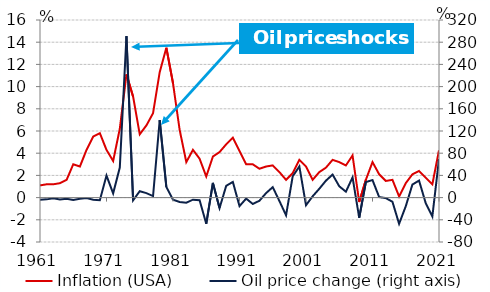
| Category | Inflation (USA) |
|---|---|
| 22282.0 | 1.1 |
| 22647.0 | 1.2 |
| 23012.0 | 1.2 |
| 23377.0 | 1.3 |
| 23743.0 | 1.6 |
| 24108.0 | 3 |
| 24473.0 | 2.8 |
| 24838.0 | 4.3 |
| 25204.0 | 5.5 |
| 25569.0 | 5.8 |
| 25934.0 | 4.3 |
| 26299.0 | 3.3 |
| 26665.0 | 6.2 |
| 27030.0 | 11.1 |
| 27395.0 | 9.1 |
| 27760.0 | 5.7 |
| 28126.0 | 6.5 |
| 28491.0 | 7.6 |
| 28856.0 | 11.3 |
| 29221.0 | 13.5 |
| 29587.0 | 10.3 |
| 29952.0 | 6.1 |
| 30317.0 | 3.2 |
| 30682.0 | 4.3 |
| 31048.0 | 3.5 |
| 31413.0 | 1.9 |
| 31778.0 | 3.7 |
| 32143.0 | 4.1 |
| 32509.0 | 4.8 |
| 32874.0 | 5.4 |
| 33239.0 | 4.2 |
| 33604.0 | 3 |
| 33970.0 | 3 |
| 34335.0 | 2.6 |
| 34700.0 | 2.8 |
| 35065.0 | 2.9 |
| 35431.0 | 2.3 |
| 35796.0 | 1.6 |
| 36161.0 | 2.2 |
| 36526.0 | 3.4 |
| 36892.0 | 2.8 |
| 37257.0 | 1.6 |
| 37622.0 | 2.3 |
| 37987.0 | 2.7 |
| 38353.0 | 3.4 |
| 38718.0 | 3.2 |
| 39083.0 | 2.9 |
| 39448.0 | 3.8 |
| 39814.0 | -0.4 |
| 40179.0 | 1.6 |
| 40544.0 | 3.2 |
| 40909.0 | 2.1 |
| 41275.0 | 1.5 |
| 41640.0 | 1.6 |
| 42005.0 | 0.1 |
| 42370.0 | 1.3 |
| 42736.0 | 2.1 |
| 43101.0 | 2.4 |
| 43466.0 | 1.8 |
| 43831.0 | 1.2 |
| 44197.0 | 4.26 |